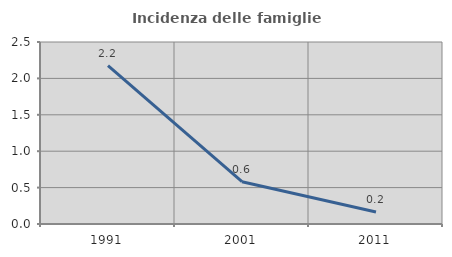
| Category | Incidenza delle famiglie numerose |
|---|---|
| 1991.0 | 2.174 |
| 2001.0 | 0.581 |
| 2011.0 | 0.164 |